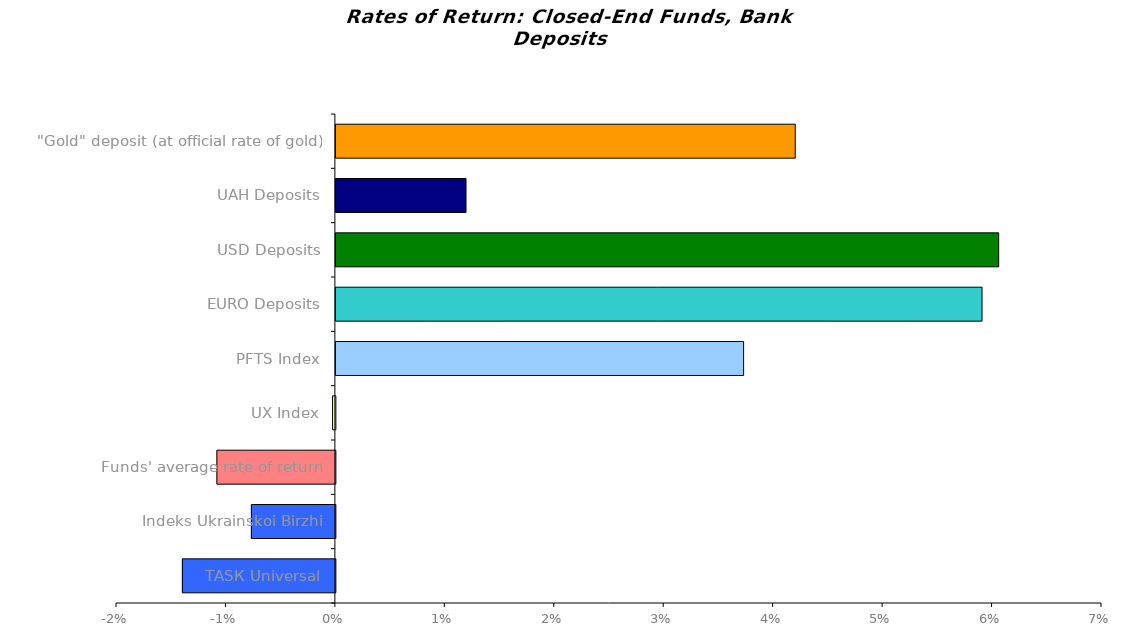
| Category | Series 0 |
|---|---|
| ТАSК Universal | -0.014 |
| Іndeks Ukrainskoi Birzhi | -0.008 |
| Funds' average rate of return | -0.011 |
| UX Index | 0 |
| PFTS Index | 0.037 |
| EURO Deposits | 0.059 |
| USD Deposits | 0.061 |
| UAH Deposits | 0.012 |
| "Gold" deposit (at official rate of gold) | 0.042 |